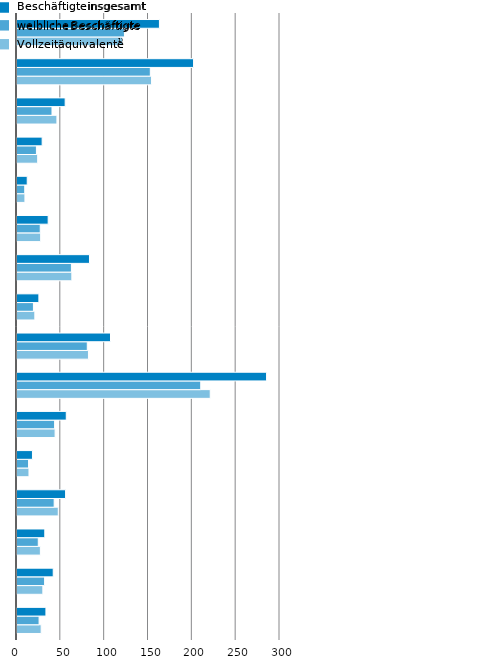
| Category | VZÄ | wB | iB |
|---|---|---|---|
| Thüringen      | 27.568 | 25.197 | 32.992 |
| Schleswig-Holstein | 29.492 | 31.487 | 41.326 |
| Sachsen-Anhalt | 26.671 | 24.259 | 31.706 |
| Sachsen        | 47.085 | 42.386 | 55.423 |
| Saarland | 13.653 | 13.174 | 17.643 |
| Rheinland-Pfalz | 43.468 | 42.905 | 56.205 |
| Nordrhein-Westfalen | 220.42 | 209.587 | 284.675 |
| Niedersachsen | 81.52 | 80.171 | 106.663 |
| Mecklenburg-Vorpommern | 20.339 | 18.738 | 24.966 |
| Hessen         | 62.553 | 62.064 | 82.681 |
| Hamburg | 26.988 | 26.506 | 35.543 |
| Bremen | 9.045 | 8.838 | 11.673 |
| Brandenburg | 23.593 | 22.142 | 28.69 |
| Berlin | 45.523 | 39.916 | 54.94 |
| Bayern | 153.48 | 152.077 | 201.41 |
| Baden-Württemberg | 120.601 | 122.554 | 162.463 |